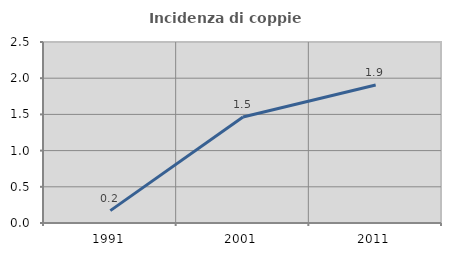
| Category | Incidenza di coppie miste |
|---|---|
| 1991.0 | 0.171 |
| 2001.0 | 1.463 |
| 2011.0 | 1.906 |